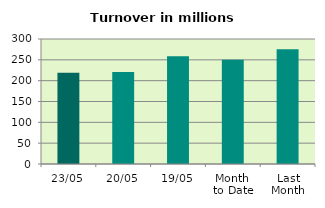
| Category | Series 0 |
|---|---|
| 23/05 | 218.976 |
| 20/05 | 220.824 |
| 19/05 | 258.827 |
| Month 
to Date | 250.47 |
| Last
Month | 275.481 |